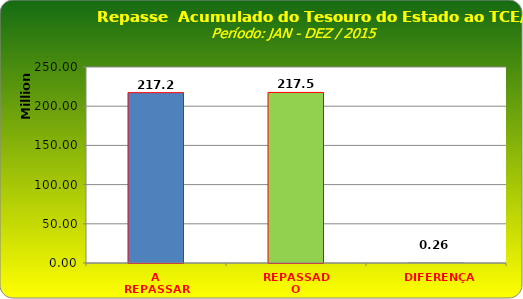
| Category | Series 0 |
|---|---|
| A REPASSAR | 217287852.7 |
| REPASSADO | 217551726.14 |
| DIFERENÇA | 263873.44 |